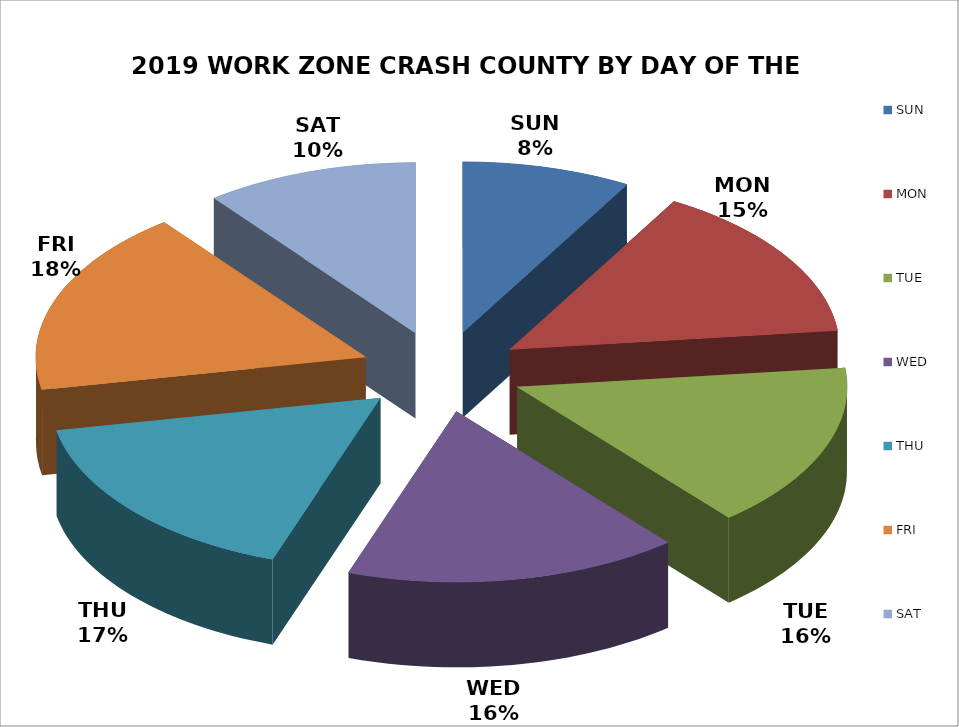
| Category | COUNT | % |
|---|---|---|
| SUN | 583 | 0.083 |
| MON | 1049 | 0.149 |
| TUE | 1103 | 0.157 |
| WED | 1152 | 0.164 |
| THU | 1170 | 0.166 |
| FRI | 1236 | 0.176 |
| SAT | 736 | 0.105 |